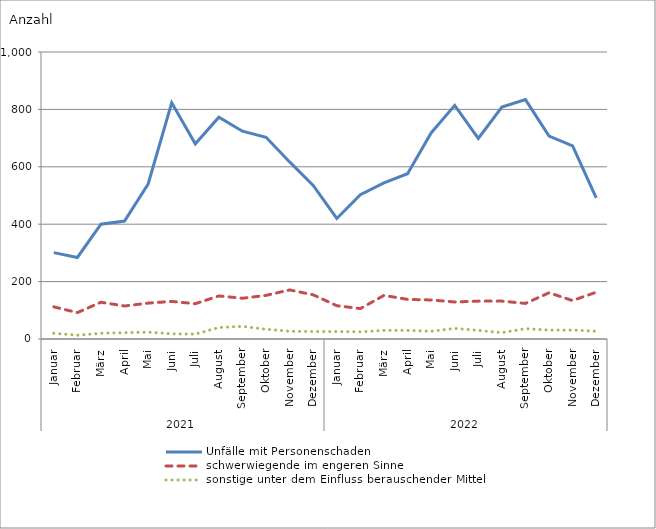
| Category | Unfälle mit Personenschaden | schwerwiegende im engeren Sinne | sonstige unter dem Einfluss berauschender Mittel |
|---|---|---|---|
| 0 | 301 | 112 | 20 |
| 1 | 284 | 92 | 13 |
| 2 | 400 | 128 | 20 |
| 3 | 411 | 115 | 22 |
| 4 | 540 | 125 | 24 |
| 5 | 823 | 131 | 18 |
| 6 | 680 | 123 | 17 |
| 7 | 773 | 150 | 40 |
| 8 | 724 | 142 | 44 |
| 9 | 703 | 152 | 34 |
| 10 | 617 | 171 | 27 |
| 11 | 535 | 154 | 26 |
| 12 | 420 | 116 | 26 |
| 13 | 503 | 106 | 25 |
| 14 | 544 | 152 | 30 |
| 15 | 576 | 138 | 30 |
| 16 | 718 | 136 | 27 |
| 17 | 814 | 129 | 37 |
| 18 | 699 | 132 | 30 |
| 19 | 808 | 132 | 22 |
| 20 | 834 | 124 | 36 |
| 21 | 707 | 161 | 31 |
| 22 | 673 | 134 | 31 |
| 23 | 492 | 163 | 27 |